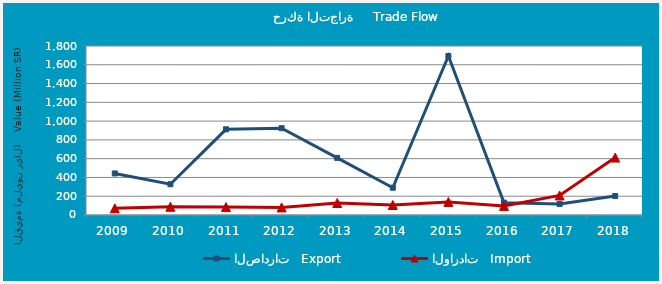
| Category | الصادرات   Export | الواردات   Import |
|---|---|---|
| 2009.0 | 442574590 | 70998567 |
| 2010.0 | 327756074 | 87917462 |
| 2011.0 | 912453023 | 84386219 |
| 2012.0 | 924614298 | 80670836 |
| 2013.0 | 608530891 | 127672900 |
| 2014.0 | 290461909 | 106436434 |
| 2015.0 | 1693484219 | 139246843 |
| 2016.0 | 131197853 | 96593346 |
| 2017.0 | 116684103 | 208173560 |
| 2018.0 | 201826259 | 611666576 |